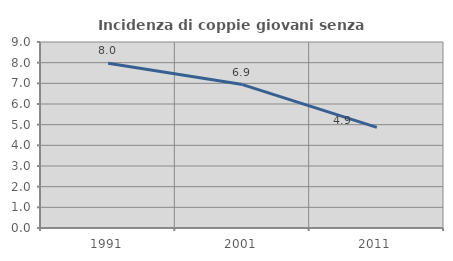
| Category | Incidenza di coppie giovani senza figli |
|---|---|
| 1991.0 | 7.971 |
| 2001.0 | 6.94 |
| 2011.0 | 4.87 |